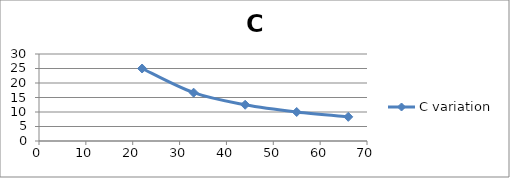
| Category | C variation |
|---|---|
| 22.0 | 25 |
| 33.0 | 16.667 |
| 44.0 | 12.5 |
| 55.0 | 10 |
| 66.0 | 8.333 |